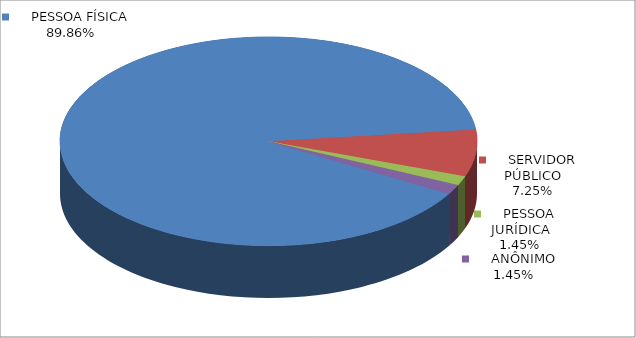
| Category | Series 0 |
|---|---|
|      PESSOA FÍSICA | 0.899 |
|      SERVIDOR PÚBLICO | 0.072 |
|      PESSOA JURÍDICA | 0.014 |
|      ANÔNIMO | 0.014 |